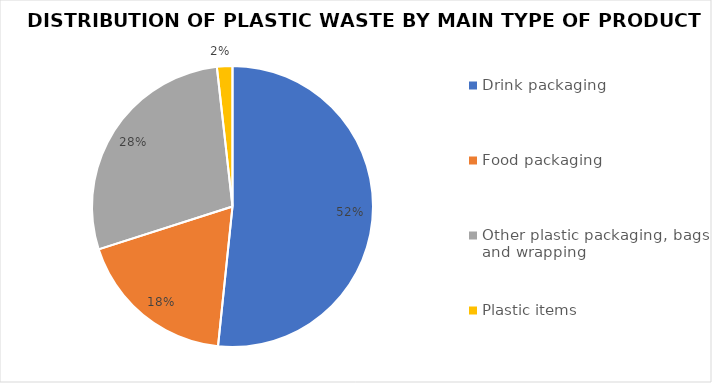
| Category | Series 0 |
|---|---|
| Drink packaging | 255.486 |
| Food packaging | 91.148 |
| Other plastic packaging, bags and wrapping | 139.284 |
| Plastic items | 8.8 |